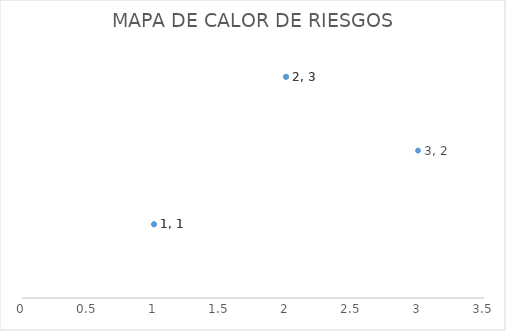
| Category | Series 0 |
|---|---|
| 3.0 | 2 |
| 1.0 | 1 |
| 2.0 | 3 |
| 2.0 | 3 |
| 1.0 | 1 |